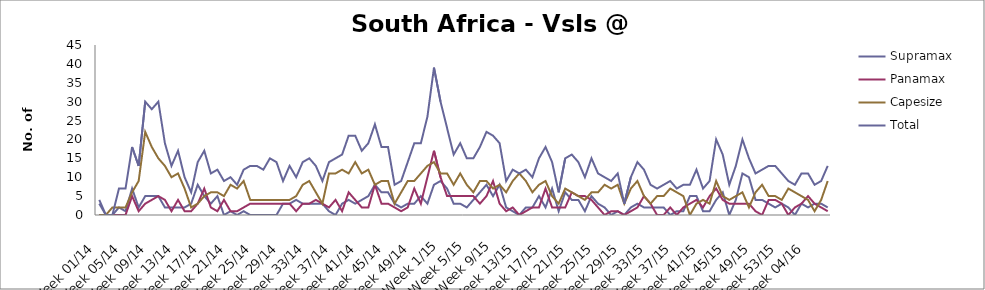
| Category | Supramax | Panamax | Capesize | Total |
|---|---|---|---|---|
| Week 01/14 | 3 | 0 | 0 | 4 |
| Week 02/14 | 0 | 0 | 0 | 0 |
| Week 03/14 | 0 | 0 | 2 | 0 |
| Week 04/14 | 2 | 0 | 2 | 7 |
| Week 05/14 | 1 | 0 | 2 | 7 |
| Week 06/14 | 7 | 5 | 6 | 18 |
| Week 07/14 | 2 | 1 | 9 | 13 |
| Week 08/14 | 5 | 3 | 22 | 30 |
| Week 09/14 | 5 | 4 | 18 | 28 |
| Week 10/14 | 5 | 5 | 15 | 30 |
| Week 11/14 | 2 | 4 | 13 | 19 |
| Week 12/14 | 2 | 1 | 10 | 13 |
| Week 13/14 | 2 | 4 | 11 | 17 |
| Week 14/14 | 2 | 1 | 7 | 10 |
| Week 15/14 | 3 | 1 | 2 | 6 |
| Week 16/14 | 8 | 3 | 3 | 14 |
| Week 17/14 | 5 | 7 | 5 | 17 |
| Week 18/14 | 3 | 2 | 6 | 11 |
| Week 19/14 | 5 | 1 | 6 | 12 |
| Week 20/14 | 0 | 4 | 5 | 9 |
| Week 21/14 | 1 | 1 | 8 | 10 |
| Week 22/14 | 0 | 1 | 7 | 8 |
| Week 23/14 | 1 | 2 | 9 | 12 |
| Week 24/14 | 0 | 3 | 4 | 13 |
| Week 25/14 | 0 | 3 | 4 | 13 |
| Week 26/14 | 0 | 3 | 4 | 12 |
| Week 27/14 | 0 | 3 | 4 | 15 |
| Week 28/14 | 0 | 3 | 4 | 14 |
| Week 29/14 | 3 | 3 | 4 | 9 |
| Week 30/14 | 3 | 3 | 4 | 13 |
| Week 31/14 | 4 | 1 | 5 | 10 |
| Week 32/14 | 3 | 3 | 8 | 14 |
| Week 33/14 | 3 | 3 | 9 | 15 |
| Week 34/14 | 3 | 4 | 6 | 13 |
| Week 35/14 | 3 | 3 | 3 | 9 |
| Week 36/14 | 1 | 2 | 11 | 14 |
| Week 37/14 | 0 | 4 | 11 | 15 |
| Week 38/14 | 3 | 1 | 12 | 16 |
| Week 39/14 | 4 | 6 | 11 | 21 |
| Week 40/14 | 3 | 4 | 14 | 21 |
| Week 41/14 | 4 | 2 | 11 | 17 |
| Week 42/14 | 5 | 2 | 12 | 19 |
| Week 43/14 | 8 | 8 | 8 | 24 |
| Week 44/14 | 6 | 3 | 9 | 18 |
| Week 45/14 | 6 | 3 | 9 | 18 |
| Week 46/14 | 3 | 2 | 3 | 8 |
| Week 47/14 | 2 | 1 | 6 | 9 |
| Week 48/14 | 3 | 2 | 9 | 14 |
| Week 49/14 | 3 | 7 | 9 | 19 |
| Week 50/14 | 5 | 3 | 11 | 19 |
| Week 51/14 | 3 | 10 | 13 | 26 |
| Week 52/14 | 8 | 17 | 14 | 39 |
| Week 1/15 | 9 | 10 | 11 | 30 |
| Week 2/15 | 7 | 5 | 11 | 23 |
| Week 3/15 | 3 | 5 | 8 | 16 |
| Week 4/15 | 3 | 5 | 11 | 19 |
| Week 5/15 | 2 | 5 | 8 | 15 |
| Week 6/15 | 4 | 5 | 6 | 15 |
| Week 7/15 | 6 | 3 | 9 | 18 |
| Week 8/15 | 8 | 5 | 9 | 22 |
| Week 9/15 | 5 | 9 | 7 | 21 |
| Week 10/15 | 8 | 3 | 8 | 19 |
| Week 11/15 | 2 | 1 | 6 | 9 |
| Week 12/15 | 1 | 2 | 9 | 12 |
| Week 13/15 | 0 | 0 | 11 | 11 |
| Week 14/15 | 2 | 1 | 9 | 12 |
| Week 15/15 | 2 | 2 | 6 | 10 |
| Week 16/15 | 5 | 2 | 8 | 15 |
| Week 17/15 | 2 | 7 | 9 | 18 |
| Week 18/15 | 7 | 2 | 5 | 14 |
| Week 19/15 | 1 | 2 | 3 | 6 |
| Week 20/15 | 6 | 2 | 7 | 15 |
| Week 21/15 | 4 | 6 | 6 | 16 |
| Week 22/15 | 4 | 5 | 5 | 14 |
| Week 23/15 | 1 | 5 | 4 | 10 |
| Week 24/15 | 5 | 4 | 6 | 15 |
| Week 25/15 | 3 | 2 | 6 | 11 |
| Week 26/15 | 2 | 0 | 8 | 10 |
| Week 27/15 | 0 | 1 | 7 | 9 |
| Week 28/15 | 1 | 1 | 8 | 11 |
| Week 29/15 | 0 | 0 | 3 | 3 |
| Week 30/15 | 2 | 1 | 7 | 10 |
| Week 31/15 | 3 | 2 | 9 | 14 |
| Week 32/15 | 2 | 5 | 5 | 12 |
| Week 33/15 | 2 | 3 | 3 | 8 |
| Week 34/15 | 2 | 0 | 5 | 7 |
| Week 35/15 | 2 | 0 | 5 | 8 |
| Week 36/15 | 0 | 2 | 7 | 9 |
| Week 37/15 | 1 | 0 | 6 | 7 |
| Week 38/15 | 1 | 2 | 5 | 8 |
| Week 39/15 | 5 | 3 | 0 | 8 |
| Week 40/15 | 5 | 4 | 3 | 12 |
| Week 41/15 | 1 | 2 | 4 | 7 |
| Week 42/15 | 1 | 5 | 3 | 9 |
| Week 43/15 | 4 | 7 | 9 | 20 |
| Week 44/15 | 6 | 4 | 5 | 16 |
| Week 45/15 | 0 | 3 | 4 | 8 |
| Week 46/15 | 4 | 3 | 5 | 13 |
| Week 47/15 | 11 | 3 | 6 | 20 |
| Week 48/15 | 10 | 3 | 2 | 15 |
| Week 49/15 | 4 | 1 | 6 | 11 |
| Week 50/15 | 4 | 0 | 8 | 12 |
| Week 51/15 | 3 | 4 | 5 | 13 |
| Week 52/15 | 2 | 4 | 5 | 13 |
| Week 53/15 | 3 | 3 | 4 | 11 |
| Week 01/16 | 2 | 0 | 7 | 9 |
| Week 02/16 | 0 | 2 | 6 | 8 |
| Week 03/16 | 3 | 3 | 5 | 11 |
| Week 04/16 | 2 | 5 | 4 | 11 |
| Week 05/16 | 3 | 3 | 1 | 8 |
| Week 06/16 | 3 | 2 | 4 | 9 |